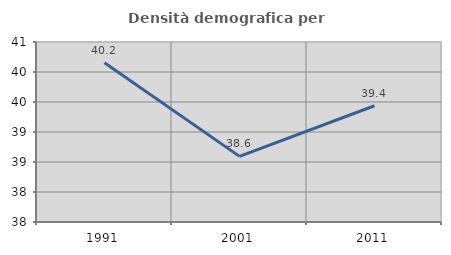
| Category | Densità demografica |
|---|---|
| 1991.0 | 40.153 |
| 2001.0 | 38.594 |
| 2011.0 | 39.438 |